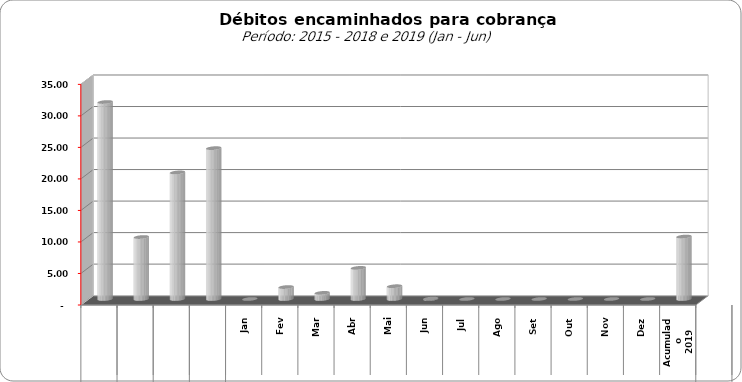
| Category |  3.309.443,02   3.859.728,44   11.181.928,25   7.600.526,01   31.248.623,50   9.830.198,34   20.083.556,95   23.931.734,08   -     1.897.202,11   974.309,37   4.937.737,42   2.030.400,14   66.339,49   -     -     -     -     -     -     9.905.988,53  |
|---|---|
| 0 | 31248623.5 |
| 1 | 9830198.34 |
| 2 | 20083556.95 |
| 3 | 23931734.08 |
| 4 | 0 |
| 5 | 1897202.11 |
| 6 | 974309.37 |
| 7 | 4937737.42 |
| 8 | 2030400.14 |
| 9 | 66339.49 |
| 10 | 0 |
| 11 | 0 |
| 12 | 0 |
| 13 | 0 |
| 14 | 0 |
| 15 | 0 |
| 16 | 9905988.53 |